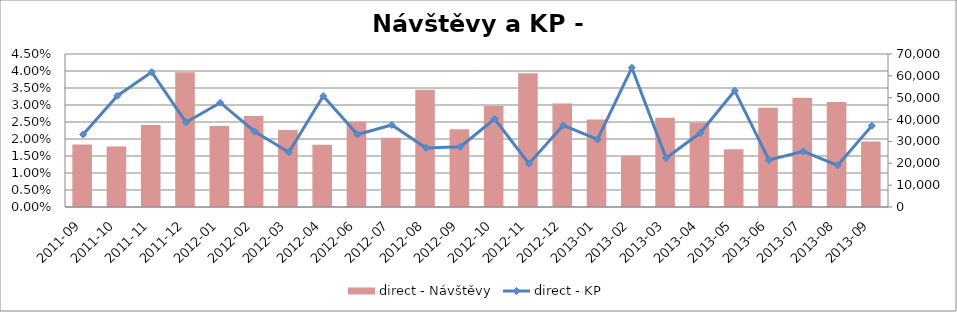
| Category | direct - Návštěvy |
|---|---|
| 2011-09 | 28584.256 |
| 2011-10 | 27690.383 |
| 2011-11 | 37485.623 |
| 2011-12 | 61693.059 |
| 2012-01 | 37010.21 |
| 2012-02 | 41677.554 |
| 2012-03 | 35267.233 |
| 2012-04 | 28459.558 |
| 2012-06 | 39017.672 |
| 2012-07 | 31653.76 |
| 2012-08 | 53661.645 |
| 2012-09 | 35520.023 |
| 2012-10 | 46239.19 |
| 2012-11 | 61203.802 |
| 2012-12 | 47354.202 |
| 2013-01 | 40050.252 |
| 2013-02 | 23479.952 |
| 2013-03 | 40803.136 |
| 2013-04 | 38577.252 |
| 2013-05 | 26419.543 |
| 2013-06 | 45415.358 |
| 2013-07 | 49965.344 |
| 2013-08 | 48030.982 |
| 2013-09 | 29977.822 |